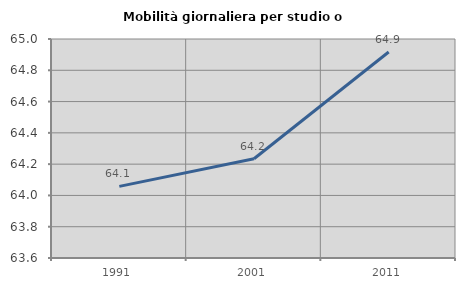
| Category | Mobilità giornaliera per studio o lavoro |
|---|---|
| 1991.0 | 64.058 |
| 2001.0 | 64.235 |
| 2011.0 | 64.917 |